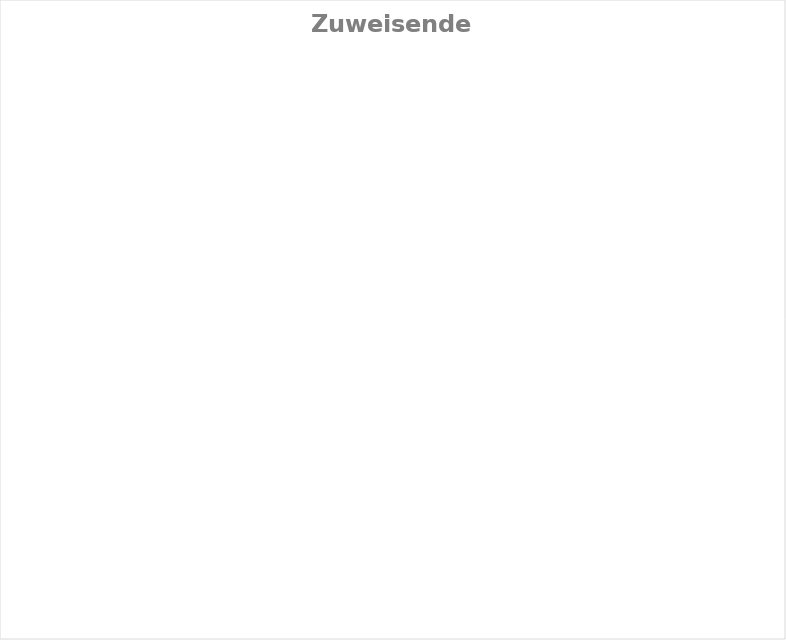
| Category | Series 0 |
|---|---|
| AG | 0 |
| AI | 0 |
| AR | 0 |
| BE | 0 |
| BL | 0 |
| BS | 0 |
| FR | 0 |
| GE | 0 |
| GL | 0 |
| GR | 0 |
| JU | 0 |
| LU | 0 |
| NE | 0 |
| NW | 0 |
| OW | 0 |
| SG | 0 |
| SH | 0 |
| SO | 0 |
| SZ | 0 |
| TG | 0 |
| TI | 0 |
| UR | 0 |
| VD | 0 |
| VS | 0 |
| ZG | 0 |
| ZH | 0 |